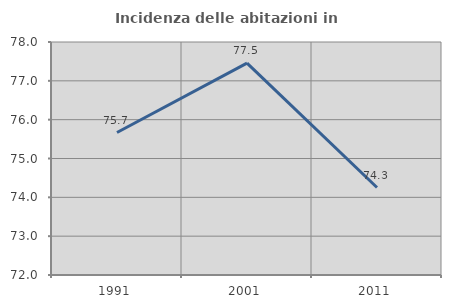
| Category | Incidenza delle abitazioni in proprietà  |
|---|---|
| 1991.0 | 75.669 |
| 2001.0 | 77.456 |
| 2011.0 | 74.253 |